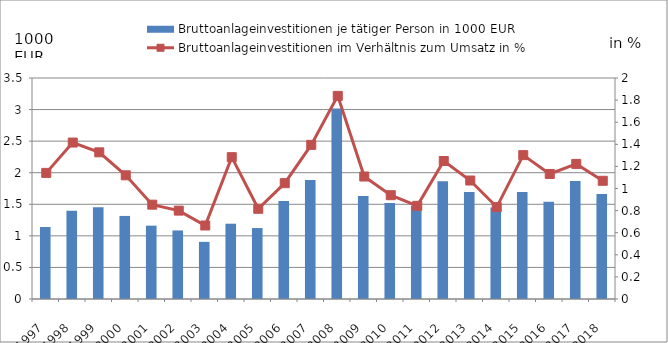
| Category | Bruttoanlageinvestitionen je tätiger Person in 1000 EUR |
|---|---|
| 1997.0 | 1.14 |
| 1998.0 | 1.4 |
| 1999.0 | 1.455 |
| 2000.0 | 1.315 |
| 2001.0 | 1.161 |
| 2002.0 | 1.086 |
| 2003.0 | 0.905 |
| 2004.0 | 1.192 |
| 2005.0 | 1.124 |
| 2006.0 | 1.554 |
| 2007.0 | 1.884 |
| 2008.0 | 3.017 |
| 2009.0 | 1.632 |
| 2010.0 | 1.521 |
| 2011.0 | 1.479 |
| 2012.0 | 1.863 |
| 2013.0 | 1.694 |
| 2014.0 | 1.448 |
| 2015.0 | 1.693 |
| 2016.0 | 1.54 |
| 2017.0 | 1.867 |
| 2018.0 | 1.663 |